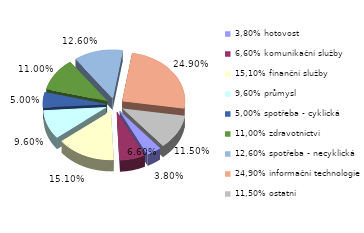
| Category | Series 0 |
|---|---|
| 3,80% hotovost | 0.038 |
| 6,60% komunikační služby | 0.066 |
| 15,10% finanční služby | 0.151 |
| 9,60% průmysl | 0.096 |
| 5,00% spotřeba - cyklická | 0.05 |
| 11,00% zdravotnictví | 0.11 |
| 12,60% spotřeba - necyklická | 0.126 |
| 24,90% informační technologie | 0.249 |
| 11,50% ostatní | 0.115 |